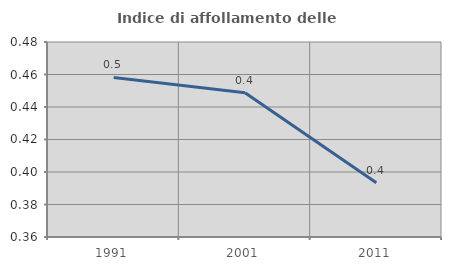
| Category | Indice di affollamento delle abitazioni  |
|---|---|
| 1991.0 | 0.458 |
| 2001.0 | 0.449 |
| 2011.0 | 0.393 |